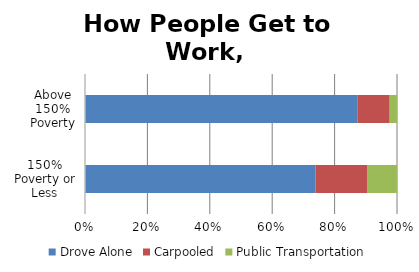
| Category | Drove Alone | Carpooled | Public Transportation |
|---|---|---|---|
| 150% Poverty or Less | 0.638 | 0.145 | 0.081 |
| Above 150% Poverty | 0.736 | 0.088 | 0.02 |